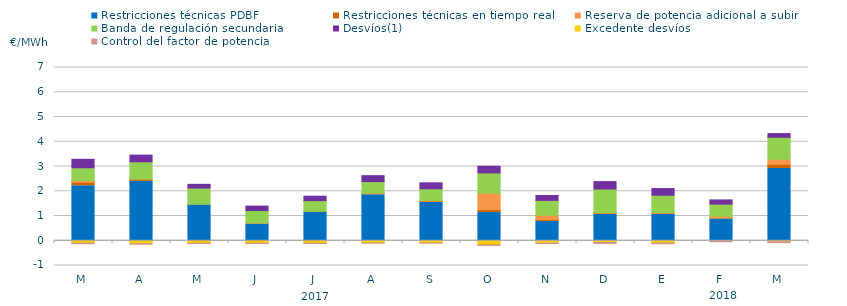
| Category | Restricciones técnicas PDBF | Restricciones técnicas en tiempo real | Reserva de potencia adicional a subir | Banda de regulación secundaria | Desvíos(1) | Excedente desvíos | Control del factor de potencia |
|---|---|---|---|---|---|---|---|
| M | 2.22 | 0.14 | 0.07 | 0.52 | 0.34 | -0.1 | -0.06 |
| A | 2.4 | 0.09 | 0.01 | 0.69 | 0.27 | -0.12 | -0.06 |
| M | 1.45 | 0.03 | 0 | 0.65 | 0.15 | -0.1 | -0.05 |
| J | 0.69 | 0.02 | 0.01 | 0.5 | 0.18 | -0.1 | -0.05 |
| J | 1.14 | 0.05 | 0 | 0.43 | 0.18 | -0.1 | -0.05 |
| A | 1.86 | 0.05 | 0.02 | 0.46 | 0.24 | -0.09 | -0.05 |
| S | 1.55 | 0.05 | 0.03 | 0.47 | 0.24 | -0.09 | -0.05 |
| O | 1.14 | 0.12 | 0.66 | 0.82 | 0.27 | -0.17 | -0.06 |
| N | 0.78 | 0.08 | 0.17 | 0.6 | 0.2 | -0.09 | -0.06 |
| D | 1.06 | 0.05 | 0.03 | 0.95 | 0.3 | -0.07 | -0.08 |
| E | 1.07 | 0.05 | 0.02 | 0.7 | 0.27 | -0.09 | -0.07 |
| F | 0.88 | 0.05 | 0.06 | 0.49 | 0.17 | -0.02 | -0.06 |
| M | 2.92 | 0.17 | 0.2 | 0.89 | 0.15 | -0.04 | -0.08 |